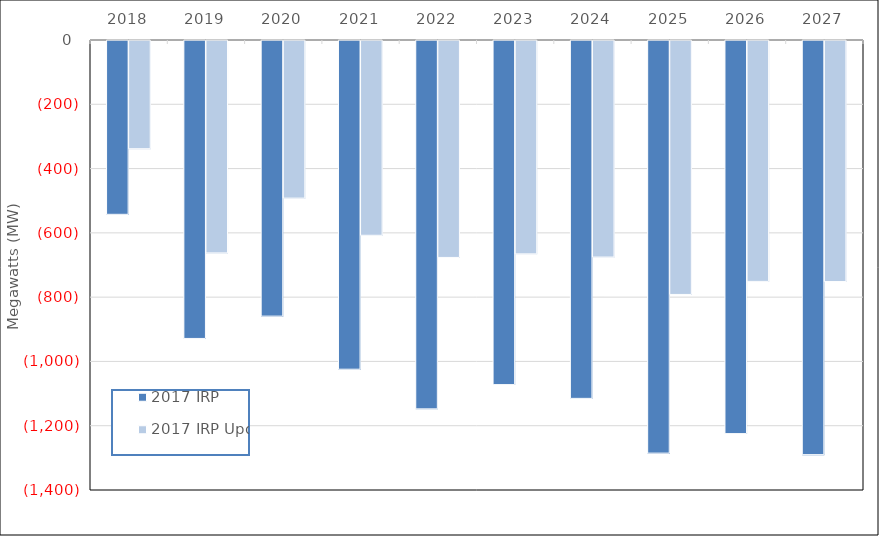
| Category | 2017 IRP | 2017 IRP Update |
|---|---|---|
| 2018.0 | -540.786 | -336.713 |
| 2019.0 | -926.954 | -660.904 |
| 2020.0 | -857.52 | -490.404 |
| 2021.0 | -1022.634 | -605.979 |
| 2022.0 | -1145.984 | -674.884 |
| 2023.0 | -1070.467 | -663.821 |
| 2024.0 | -1113.363 | -673.77 |
| 2025.0 | -1283.729 | -790.067 |
| 2026.0 | -1222.921 | -749.432 |
| 2027.0 | -1288.436 | -749.882 |